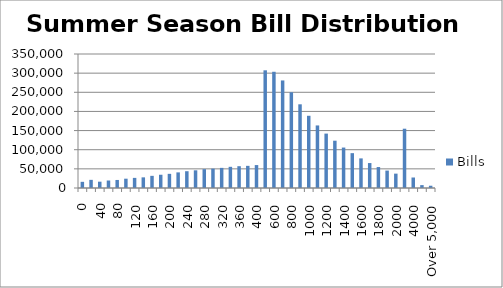
| Category | Bills |
|---|---|
| 0 | 16117.896 |
| 20 | 21293.094 |
| 40 | 16496.363 |
| 60 | 19592.152 |
| 80 | 20987.662 |
| 100 | 24309.128 |
| 120 | 26427.595 |
| 140 | 27794.365 |
| 160 | 31751.859 |
| 180 | 34608.67 |
| 200 | 36985.827 |
| 220 | 40807.062 |
| 240 | 43857.258 |
| 260 | 46185.998 |
| 280 | 49223.638 |
| 300 | 50547.377 |
| 320 | 52561.747 |
| 340 | 55340.337 |
| 360 | 56964.538 |
| 380 | 57855.724 |
| 400 | 59889.352 |
| 500 | 307396.092 |
| 600 | 303570.624 |
| 700 | 280917.489 |
| 800 | 250051.714 |
| 900 | 218608.574 |
| 1000 | 188630.789 |
| 1100 | 163387.103 |
| 1200 | 142081.951 |
| 1300 | 123542.084 |
| 1400 | 105634.524 |
| 1500 | 91016.698 |
| 1600 | 77339.005 |
| 1700 | 65160.088 |
| 1800 | 54742.673 |
| 1900 | 45481.785 |
| 2000 | 37515.271 |
| 3000 | 154870.984 |
| 4000 | 27437.888 |
| 5000 | 7528.611 |
| Over 5,000 | 5921.275 |